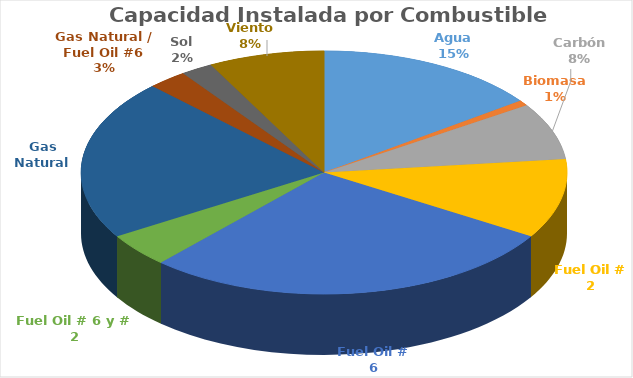
| Category | Potencia  (MW) | % |
|---|---|---|
| Agua | 615.52 | 0.149 |
| Biomasa | 30 | 0.007 |
| Carbón | 311.87 | 0.076 |
| Fuel Oil # 2 | 434.5 | 0.106 |
| Fuel Oil # 6 | 1149.14 | 0.279 |
| Fuel Oil # 6 y # 2 | 185 | 0.045 |
| Gas Natural | 879.17 | 0.213 |
| Gas Natural / Fuel Oil #6 | 108 | 0.026 |
| Sol | 87.96 | 0.021 |
| Viento | 317.25 | 0.077 |